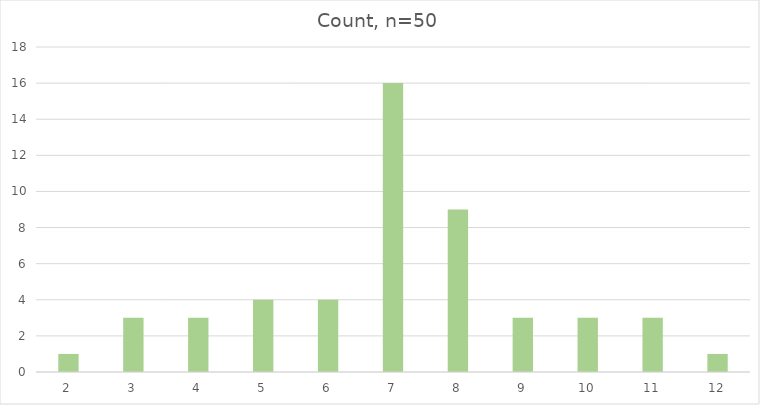
| Category | Count, n=50 |
|---|---|
| 2.0 | 1 |
| 3.0 | 3 |
| 4.0 | 3 |
| 5.0 | 4 |
| 6.0 | 4 |
| 7.0 | 16 |
| 8.0 | 9 |
| 9.0 | 3 |
| 10.0 | 3 |
| 11.0 | 3 |
| 12.0 | 1 |